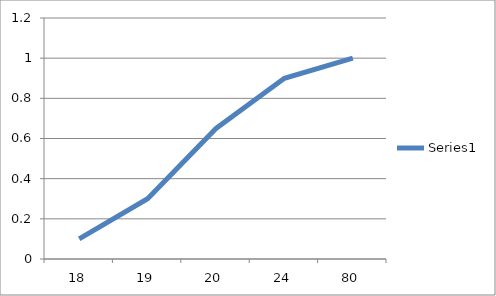
| Category | Series 0 |
|---|---|
| 18.0 | 0.1 |
| 19.0 | 0.3 |
| 20.0 | 0.65 |
| 24.0 | 0.9 |
| 80.0 | 1 |